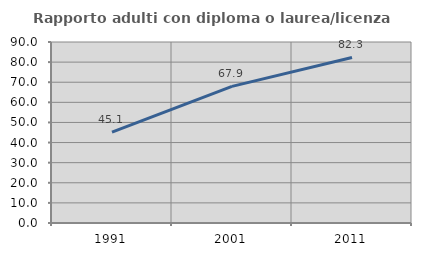
| Category | Rapporto adulti con diploma o laurea/licenza media  |
|---|---|
| 1991.0 | 45.149 |
| 2001.0 | 67.942 |
| 2011.0 | 82.332 |